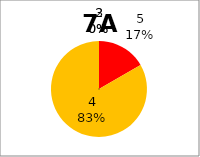
| Category | Series 0 |
|---|---|
| 5.0 | 1 |
| 4.0 | 5 |
| 3.0 | 0 |
| 2.0 | 0 |